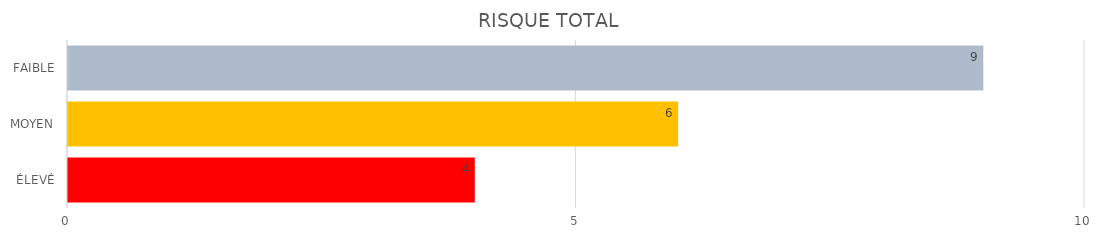
| Category | Series 1 | Series 0 |
|---|---|---|
| ÉLEVÉ | 4 | 4 |
| MOYEN | 6 | 6 |
| FAIBLE | 9 | 9 |